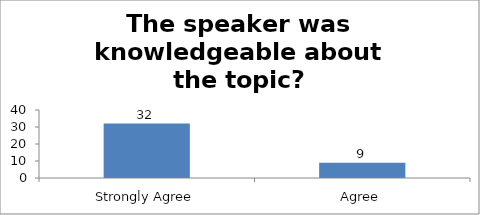
| Category | The speaker was knowledgeable about the topic? |
|---|---|
| Strongly Agree | 32 |
| Agree | 9 |